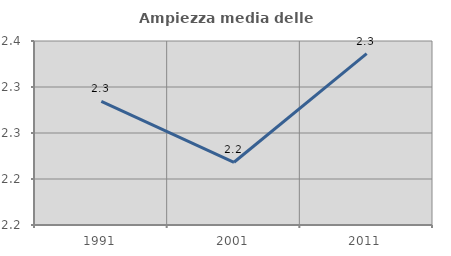
| Category | Ampiezza media delle famiglie |
|---|---|
| 1991.0 | 2.284 |
| 2001.0 | 2.218 |
| 2011.0 | 2.336 |